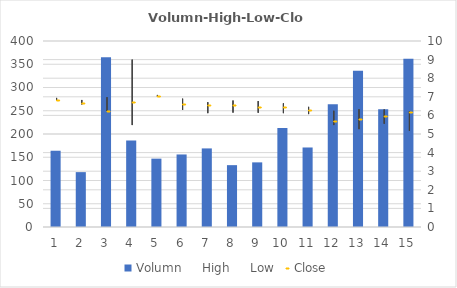
| Category | Volumn |
|---|---|
| 0 | 164 |
| 1 | 118 |
| 2 | 365 |
| 3 | 186 |
| 4 | 147 |
| 5 | 156 |
| 6 | 169 |
| 7 | 133 |
| 8 | 139 |
| 9 | 213 |
| 10 | 171 |
| 11 | 264 |
| 12 | 336 |
| 13 | 253 |
| 14 | 362 |